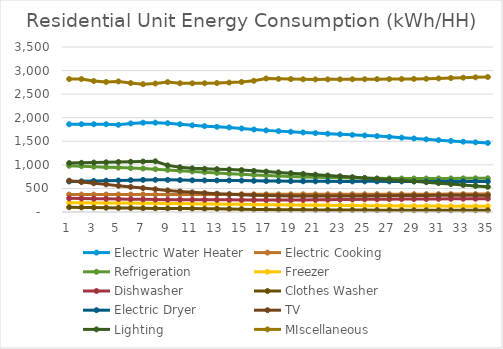
| Category | Electric Water Heater | Electric Cooking | Refrigeration | Freezer | Dishwasher | Clothes Washer | Electric Dryer | TV | Lighting | MIscellaneous |
|---|---|---|---|---|---|---|---|---|---|---|
| 0 | 1861.798 | 369.092 | 981.106 | 195.132 | 290.855 | 100.55 | 647.663 | 664.925 | 1036.944 | 2819.753 |
| 1 | 1861.798 | 369.359 | 971.646 | 193.804 | 286.58 | 97.205 | 651.123 | 634.474 | 1043.631 | 2820.461 |
| 2 | 1861.798 | 369.611 | 960.789 | 192.382 | 282.708 | 93.825 | 658.764 | 609.731 | 1048.712 | 2779.195 |
| 3 | 1861.798 | 370.954 | 951.828 | 191.354 | 279.395 | 90.587 | 664.478 | 586.035 | 1053.854 | 2758.444 |
| 4 | 1849.425 | 371.221 | 942.368 | 190.026 | 275.121 | 87.241 | 667.939 | 555.584 | 1060.54 | 2770.269 |
| 5 | 1878.5 | 371.473 | 931.51 | 188.604 | 271.249 | 83.861 | 675.579 | 530.842 | 1065.621 | 2735.229 |
| 6 | 1893.448 | 372.815 | 922.549 | 187.575 | 267.936 | 80.623 | 681.293 | 507.145 | 1070.763 | 2711.147 |
| 7 | 1895.221 | 372.012 | 908.125 | 185.45 | 263.002 | 76.875 | 683.872 | 482.699 | 1075.726 | 2725.165 |
| 8 | 1883.047 | 372.272 | 892.478 | 182.239 | 262.053 | 75.266 | 681.45 | 458.055 | 989.04 | 2755.451 |
| 9 | 1861.256 | 372.602 | 876.222 | 178.892 | 261.206 | 73.67 | 676.769 | 436.081 | 948.646 | 2730.773 |
| 10 | 1838.16 | 372.939 | 859.678 | 175.548 | 260.228 | 72.105 | 672.189 | 416.495 | 926.646 | 2729.402 |
| 11 | 1821.201 | 373.263 | 843.016 | 172.197 | 259.298 | 70.6 | 670.176 | 401.065 | 915.648 | 2731.286 |
| 12 | 1806.977 | 373.589 | 827.321 | 168.809 | 258.387 | 66.878 | 669.939 | 388.454 | 909.351 | 2735.193 |
| 13 | 1793.958 | 373.931 | 812.593 | 165.369 | 257.415 | 63.213 | 669.667 | 377.574 | 901.98 | 2745.671 |
| 14 | 1772.371 | 374.274 | 798.858 | 161.912 | 256.262 | 59.432 | 666.12 | 367.235 | 888.788 | 2757.702 |
| 15 | 1750.435 | 374.6 | 786.157 | 158.494 | 254.907 | 55.626 | 661.358 | 357.804 | 872.608 | 2782.944 |
| 16 | 1731.441 | 374.925 | 774.417 | 155.238 | 254.222 | 52.358 | 657.777 | 350.544 | 856.578 | 2832.011 |
| 17 | 1715.478 | 375.249 | 763.595 | 152.127 | 254.233 | 49.585 | 655.328 | 345.193 | 840.355 | 2824.694 |
| 18 | 1701.497 | 375.579 | 753.722 | 149.156 | 254.95 | 47.251 | 653.745 | 341.466 | 823.943 | 2819.541 |
| 19 | 1687.252 | 375.899 | 744.984 | 146.339 | 256.354 | 45.327 | 652.131 | 338.886 | 807.609 | 2815.664 |
| 20 | 1673.216 | 376.204 | 737.337 | 143.677 | 258.382 | 43.788 | 650.645 | 337.378 | 791.221 | 2812.907 |
| 21 | 1660.066 | 376.492 | 730.747 | 141.178 | 260.961 | 42.626 | 649.639 | 337.03 | 774.61 | 2813.265 |
| 22 | 1648.026 | 376.774 | 725.15 | 138.833 | 263.961 | 41.836 | 649.225 | 337.725 | 757.605 | 2814.75 |
| 23 | 1636.421 | 377.055 | 720.49 | 136.625 | 266.653 | 40.919 | 649.318 | 339.197 | 740.276 | 2816.357 |
| 24 | 1623.786 | 377.335 | 716.754 | 134.577 | 268.993 | 39.929 | 649.68 | 341.092 | 722.666 | 2817.628 |
| 25 | 1609.868 | 377.607 | 713.877 | 132.686 | 270.967 | 38.949 | 649.739 | 343.308 | 704.808 | 2818.167 |
| 26 | 1594.67 | 377.876 | 711.835 | 130.946 | 272.637 | 38.075 | 649.506 | 345.541 | 686.661 | 2819.089 |
| 27 | 1577.469 | 378.142 | 710.591 | 129.353 | 274.126 | 37.387 | 649.205 | 347.896 | 668.299 | 2820.943 |
| 28 | 1559.487 | 378.407 | 710.164 | 127.9 | 275.519 | 36.921 | 649.018 | 350.09 | 649.719 | 2823.193 |
| 29 | 1541.315 | 378.671 | 710.572 | 126.611 | 276.865 | 36.663 | 649.03 | 352.128 | 630.931 | 2826.577 |
| 30 | 1523.799 | 378.935 | 711.754 | 125.469 | 278.181 | 36.558 | 649.273 | 353.925 | 611.898 | 2833.466 |
| 31 | 1507.334 | 379.198 | 712.918 | 124.495 | 279.465 | 36.545 | 649.545 | 355.012 | 592.635 | 2842.131 |
| 32 | 1491.59 | 379.459 | 714.049 | 123.697 | 280.676 | 36.574 | 649.348 | 355.076 | 573.158 | 2850.028 |
| 33 | 1477.205 | 379.717 | 715.122 | 123.073 | 281.793 | 36.618 | 648.683 | 353.968 | 553.472 | 2856.745 |
| 34 | 1464.754 | 379.975 | 716.134 | 122.617 | 282.822 | 36.665 | 647.759 | 351.52 | 533.59 | 2863.22 |